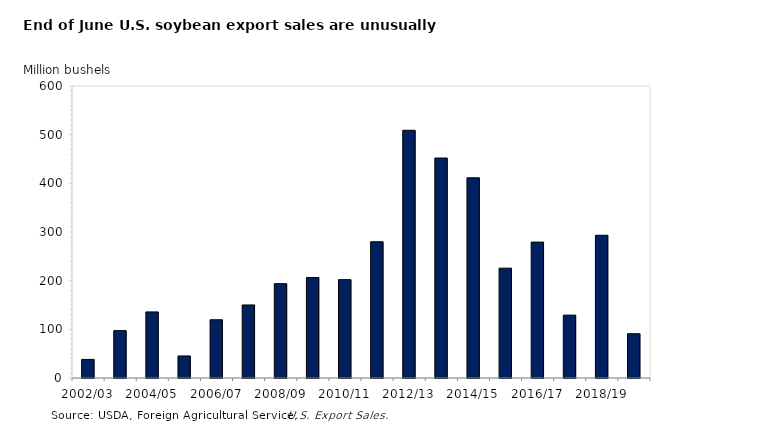
| Category | Soybean |
|---|---|
| 2002/03 | 38.18 |
| 2003/04 | 97.334 |
| 2004/05 | 135.83 |
| 2005/06 | 45.301 |
| 2006/07 | 119.663 |
| 2007/08 | 150.072 |
| 2008/09 | 193.874 |
| 2009/10 | 206.514 |
| 2010/11 | 202.12 |
| 2011/12 | 279.954 |
| 2012/13 | 509.01 |
| 2013/14 | 451.999 |
| 2014/15 | 411.386 |
| 2015/16 | 225.724 |
| 2016/17 | 279.197 |
| 2017/18 | 129.182 |
| 2018/19 | 293.294 |
| 2019/20 | 90.975 |